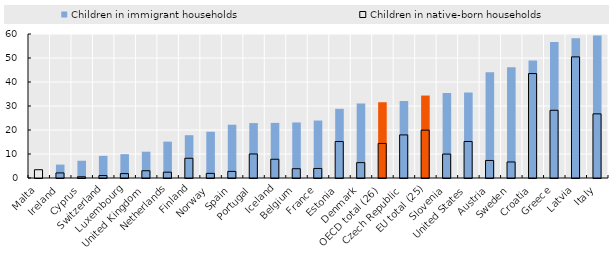
| Category | Children in immigrant households | Children in native-born households |
|---|---|---|
| Malta | 0 | 3.446 |
| Ireland | 5.585 | 2.11 |
| Cyprus | 7.188 | 0.497 |
| Switzerland | 9.231 | 1.011 |
| Luxembourg | 9.943 | 1.828 |
| United Kingdom | 10.965 | 3.027 |
| Netherlands | 15.154 | 2.426 |
| Finland | 17.836 | 8.225 |
| Norway | 19.278 | 1.933 |
| Spain | 22.202 | 2.743 |
| Portugal | 22.887 | 10.014 |
| Iceland | 22.968 | 7.813 |
| Belgium | 23.148 | 3.869 |
| France | 23.942 | 3.972 |
| Estonia | 28.823 | 15.19 |
| Denmark | 31.051 | 6.411 |
| OECD total (26) | 31.57 | 14.396 |
| Czech Republic | 32.083 | 17.952 |
| EU total (25) | 34.355 | 19.943 |
| Slovenia | 35.461 | 9.972 |
| United States | 35.6 | 15.21 |
| Austria | 44.073 | 7.31 |
| Sweden | 46.159 | 6.685 |
| Croatia | 48.971 | 43.515 |
| Greece | 56.685 | 28.217 |
| Latvia | 58.182 | 50.474 |
| Italy | 59.382 | 26.719 |